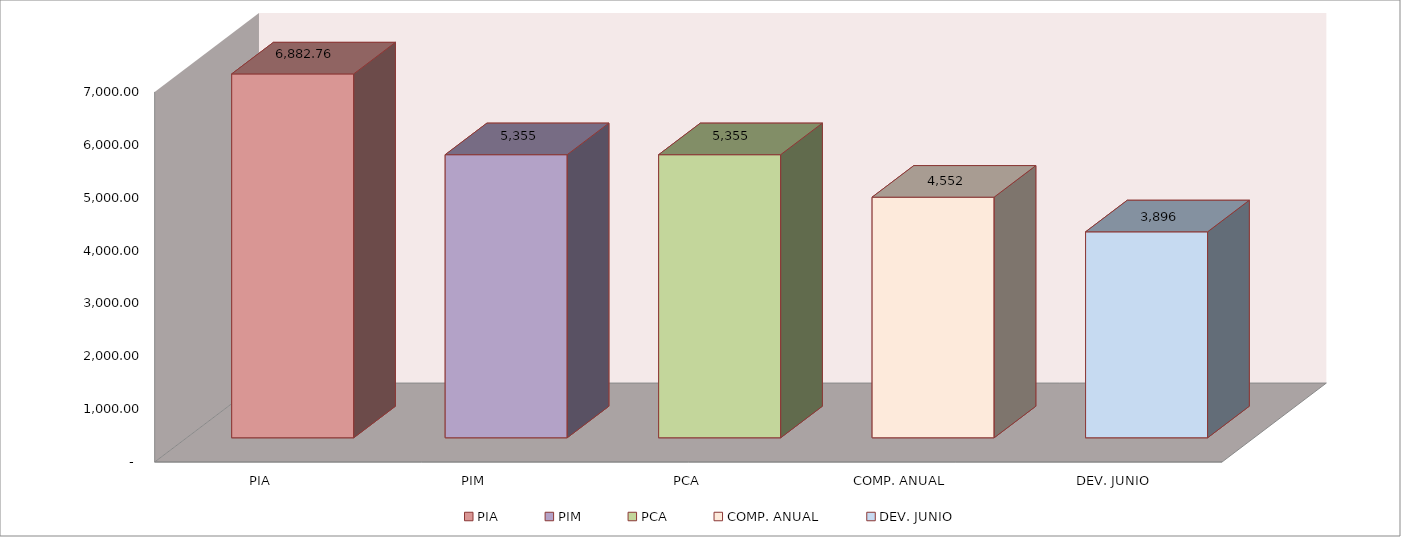
| Category | 011 MINISTERIO DE SALUD |
|---|---|
| PIA | 6882.759 |
| PIM | 5354.678 |
| PCA | 5354.678 |
| COMP. ANUAL | 4551.507 |
| DEV. JUNIO | 3895.881 |